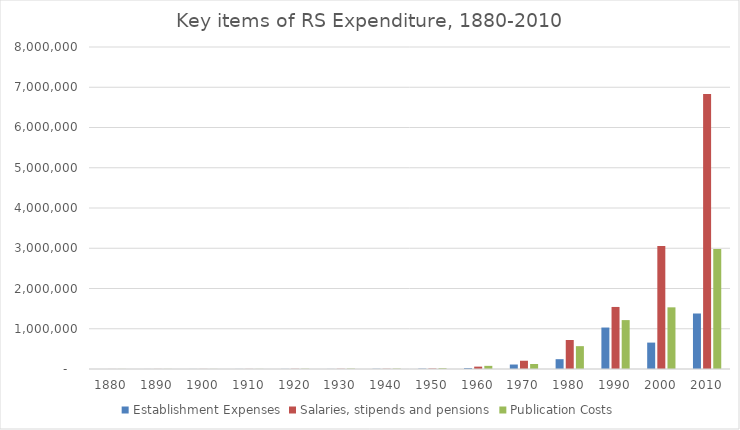
| Category | Establishment Expenses | Salaries, stipends and pensions | Publication Costs |
|---|---|---|---|
| 1880.0 | 616.762 | 1089.588 | 2121.729 |
| 1890.0 | 874.983 | 1755.6 | 2196.808 |
| 1900.0 | 1201.204 | 1937.088 | 2016.55 |
| 1910.0 | 1619.908 | 2351.525 | 2563.2 |
| 1920.0 | 2486.396 | 4440.896 | 6134.038 |
| 1930.0 | 1857.779 | 5018.058 | 9284.983 |
| 1940.0 | 5306.383 | 5351.404 | 9421.796 |
| 1950.0 | 9193.162 | 11162.429 | 19305.725 |
| 1960.0 | 23444 | 58854 | 78033 |
| 1970.0 | 111334 | 205196 | 124783 |
| 1980.0 | 243878 | 720564 | 567587 |
| 1990.0 | 1030196 | 1541571 | 1214875 |
| 2000.0 | 656000 | 3053000 | 1532000 |
| 2010.0 | 1379000 | 6834000 | 2984000 |